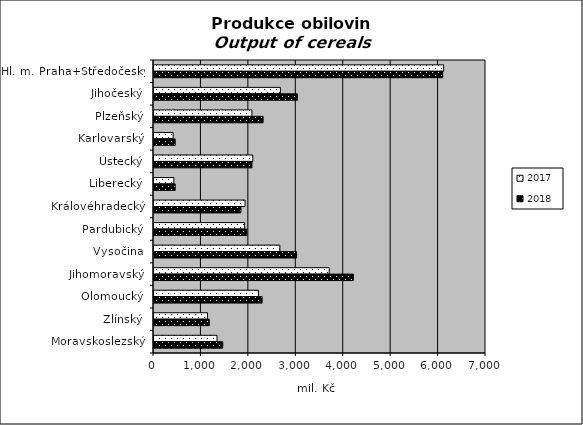
| Category | 2017 | 2018 |
|---|---|---|
| Hl. m. Praha+Středočeský | 6106.463 | 6086.461 |
| Jihočeský | 2664.727 | 3025.67 |
| Plzeňský | 2063.909 | 2300.669 |
| Karlovarský | 403.286 | 446.213 |
| Ústecký | 2083.126 | 2065.052 |
| Liberecký | 418.835 | 446.415 |
| Královéhradecký | 1919.268 | 1833.956 |
| Pardubický | 1911.375 | 1953.99 |
| Vysočina | 2654.275 | 3005.952 |
| Jihomoravský | 3694.069 | 4204.017 |
| Olomoucký | 2201.23 | 2279.982 |
| Zlínský | 1128.46 | 1165.231 |
| Moravskoslezský | 1328.087 | 1449.922 |